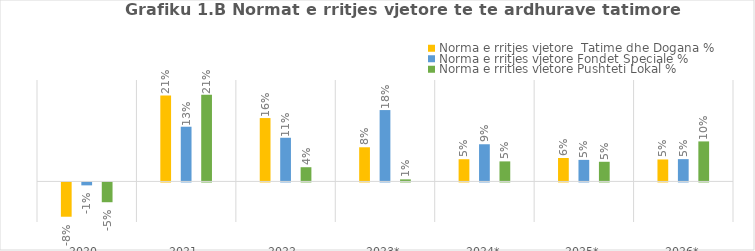
| Category | Norma e rritjes vjetore  Tatime dhe Dogana %  | Norma e rritjes vjetore Fondet Speciale %  | Norma e rritjes vjetore Pushteti Lokal %  |
|---|---|---|---|
| 2020  | -0.085 | -0.007 | -0.049 |
| 2021  | 0.212 | 0.135 | 0.213 |
| 2022  | 0.156 | 0.108 | 0.035 |
| 2023* | 0.084 | 0.176 | 0.005 |
| 2024* | 0.055 | 0.092 | 0.049 |
| 2025* | 0.058 | 0.053 | 0.048 |
| 2026* | 0.054 | 0.055 | 0.099 |